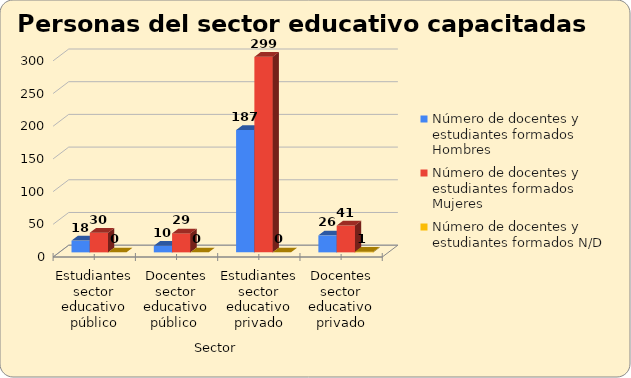
| Category | Número de docentes y estudiantes formados |
|---|---|
| Estudiantes sector educativo público | 0 |
| Docentes sector educativo público  | 0 |
| Estudiantes sector educativo privado | 0 |
| Docentes sector educativo privado | 1 |